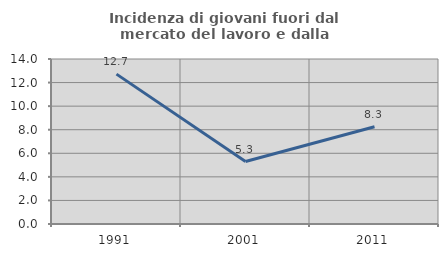
| Category | Incidenza di giovani fuori dal mercato del lavoro e dalla formazione  |
|---|---|
| 1991.0 | 12.717 |
| 2001.0 | 5.303 |
| 2011.0 | 8.257 |